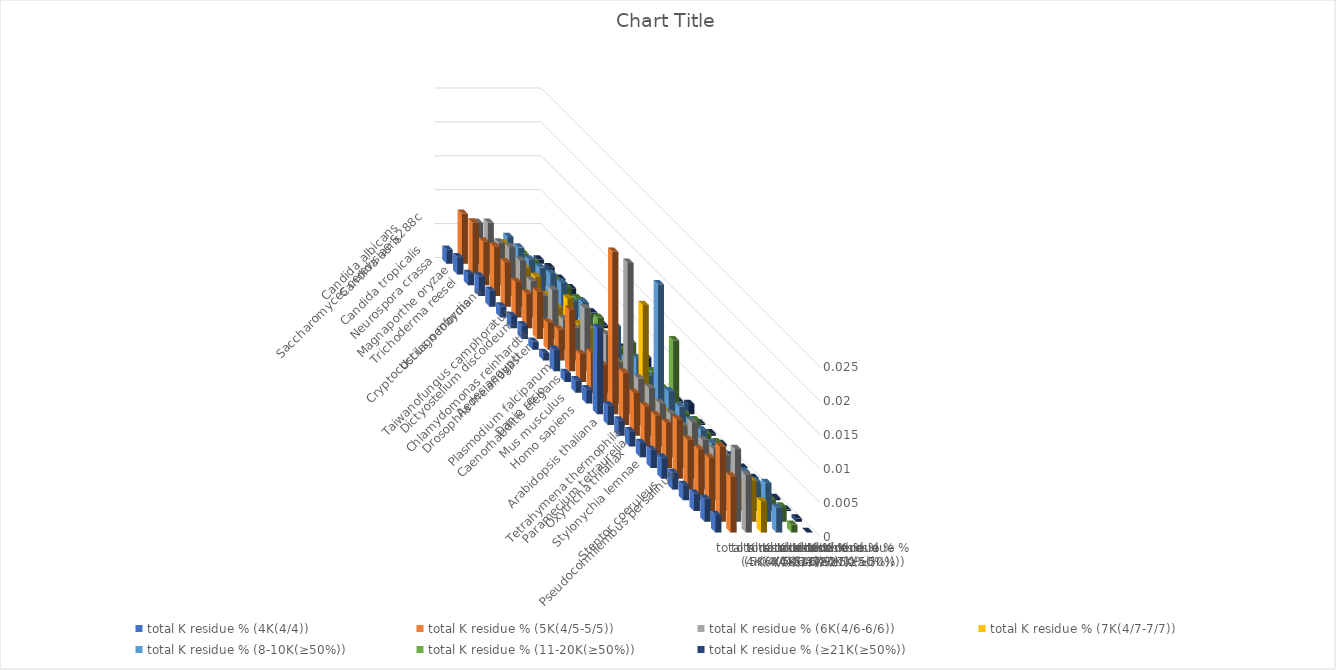
| Category | total K residue % (4K(4/4)) | total K residue % (5K(4/5-5/5)) | total K residue % (6K(4/6-6/6)) | total K residue % (7K(4/7-7/7)) | total K residue % (8-10K(≥50%)) | total K residue % (11-20K(≥50%)) | total K residue % (≥21K(≥50%)) |
|---|---|---|---|---|---|---|---|
| Saccharomyces cerevisiae S288c | 0.002 | 0.007 | 0.006 | 0.003 | 0.004 | 0.002 | 0.001 |
| Candida albicans | 0.003 | 0.008 | 0.008 | 0.005 | 0.004 | 0.002 | 0.001 |
| Candida auris | 0.002 | 0.006 | 0.006 | 0.003 | 0.004 | 0.002 | 0.001 |
| Candida tropicalis | 0.003 | 0.007 | 0.007 | 0.004 | 0.004 | 0.002 | 0.001 |
| Neurospora crassa | 0.002 | 0.007 | 0.007 | 0.004 | 0.005 | 0.003 | 0.001 |
| Magnaporthe oryzae | 0.002 | 0.005 | 0.005 | 0.003 | 0.005 | 0.003 | 0.001 |
| Trichoderma reesei | 0.002 | 0.005 | 0.005 | 0.003 | 0.004 | 0.002 | 0 |
| Cryptococcus neoformans | 0.002 | 0.007 | 0.007 | 0.006 | 0.005 | 0.003 | 0 |
| Ustilago maydis | 0.001 | 0.004 | 0.005 | 0.004 | 0.003 | 0.001 | 0 |
| Taiwanofungus camphoratus | 0.001 | 0.005 | 0.005 | 0.005 | 0.004 | 0.002 | 0 |
| Dictyostelium discoideum | 0.003 | 0.009 | 0.009 | 0.006 | 0.007 | 0.004 | 0.002 |
| Chlamydomonas reinhardtii | 0.001 | 0.004 | 0.003 | 0.003 | 0.003 | 0.002 | 0 |
| Drosophila melanogaster | 0.002 | 0.006 | 0.009 | 0.004 | 0.005 | 0.003 | 0 |
| Aedes aegypti | 0.002 | 0.006 | 0.006 | 0.003 | 0.004 | 0.002 | 0 |
| Plasmodium falciparum | 0.013 | 0.024 | 0.022 | 0.016 | 0.019 | 0.011 | 0.002 |
| Caenorhabditis elegans | 0.003 | 0.008 | 0.007 | 0.003 | 0.005 | 0.002 | 0 |
| Danio rerio | 0.002 | 0.006 | 0.007 | 0.004 | 0.004 | 0.002 | 0 |
| Mus musculus | 0.002 | 0.006 | 0.006 | 0.004 | 0.004 | 0.002 | 0 |
| Homo sapiens | 0.002 | 0.006 | 0.006 | 0.004 | 0.004 | 0.002 | 0 |
| Arabidopsis thaliana | 0.003 | 0.007 | 0.006 | 0.004 | 0.004 | 0.001 | 0 |
| Tetrahymena thermophila | 0.003 | 0.009 | 0.008 | 0.004 | 0.004 | 0.001 | 0 |
| Paramecium tetraurelia | 0.002 | 0.007 | 0.007 | 0.004 | 0.003 | 0.001 | 0 |
| Oxytricha trifallax | 0.002 | 0.008 | 0.008 | 0.004 | 0.004 | 0.001 | 0 |
| Stylonychia lemnae | 0.003 | 0.008 | 0.008 | 0.004 | 0.004 | 0.002 | 0 |
| Pseudocohnilembus persalinus | 0.003 | 0.011 | 0.011 | 0.006 | 0.006 | 0.002 | 0 |
| Stentor coeruleus | 0.003 | 0.008 | 0.009 | 0.005 | 0.004 | 0.001 | 0 |